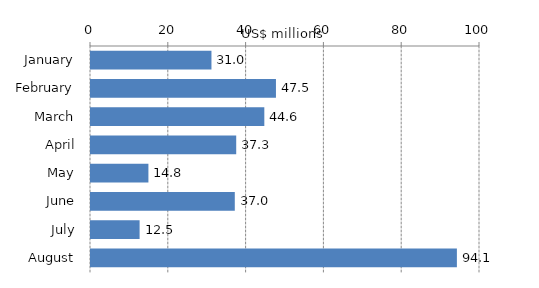
| Category | Series 0 |
|---|---|
| January | 30.966 |
| February | 47.545 |
| March | 44.556 |
| April | 37.33 |
| May | 14.759 |
| June | 36.966 |
| July | 12.494 |
| August | 94.06 |